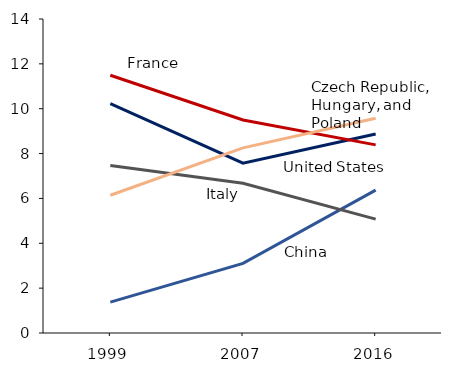
| Category | United States | China | France | Italy | Poland, Hungary and Czech Republic |
|---|---|---|---|---|---|
| 1999.0 | 10.232 | 1.378 | 11.49 | 7.465 | 6.141 |
| 2007.0 | 7.57 | 3.102 | 9.5 | 6.674 | 8.255 |
| 2016.0 | 8.871 | 6.371 | 8.388 | 5.077 | 9.575 |